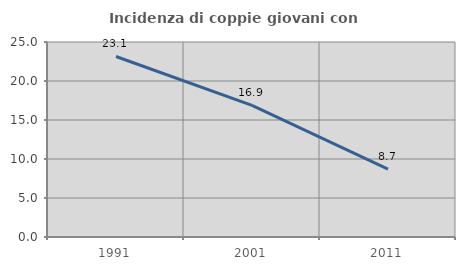
| Category | Incidenza di coppie giovani con figli |
|---|---|
| 1991.0 | 23.142 |
| 2001.0 | 16.882 |
| 2011.0 | 8.714 |